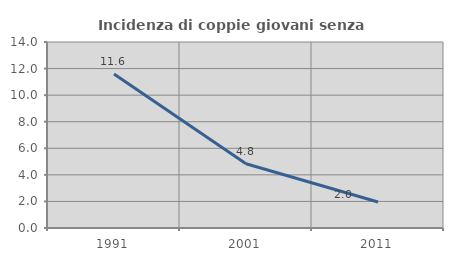
| Category | Incidenza di coppie giovani senza figli |
|---|---|
| 1991.0 | 11.594 |
| 2001.0 | 4.839 |
| 2011.0 | 1.961 |